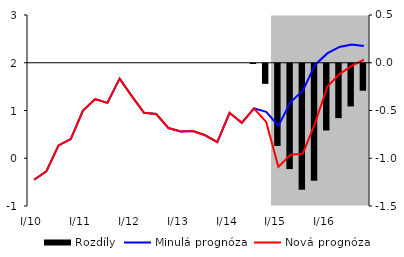
| Category | Rozdíly |
|---|---|
| 0 | 0 |
| 1 | 0 |
| 2 | 0 |
| 3 | 0 |
| 4 | 0 |
| 5 | 0 |
| 6 | 0 |
| 7 | 0 |
| 8 | 0 |
| 9 | 0 |
| 10 | 0 |
| 11 | 0 |
| 12 | 0 |
| 13 | 0 |
| 14 | 0 |
| 15 | 0 |
| 16 | 0 |
| 17 | 0 |
| 18 | -0.003 |
| 19 | -0.21 |
| 20 | -0.86 |
| 21 | -1.103 |
| 22 | -1.319 |
| 23 | -1.225 |
| 24 | -0.699 |
| 25 | -0.569 |
| 26 | -0.447 |
| 27 | -0.282 |